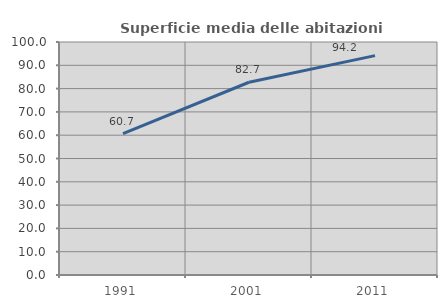
| Category | Superficie media delle abitazioni occupate |
|---|---|
| 1991.0 | 60.66 |
| 2001.0 | 82.72 |
| 2011.0 | 94.155 |